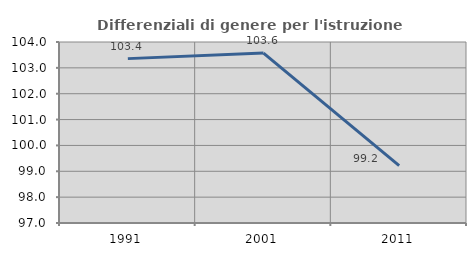
| Category | Differenziali di genere per l'istruzione superiore |
|---|---|
| 1991.0 | 103.357 |
| 2001.0 | 103.572 |
| 2011.0 | 99.218 |